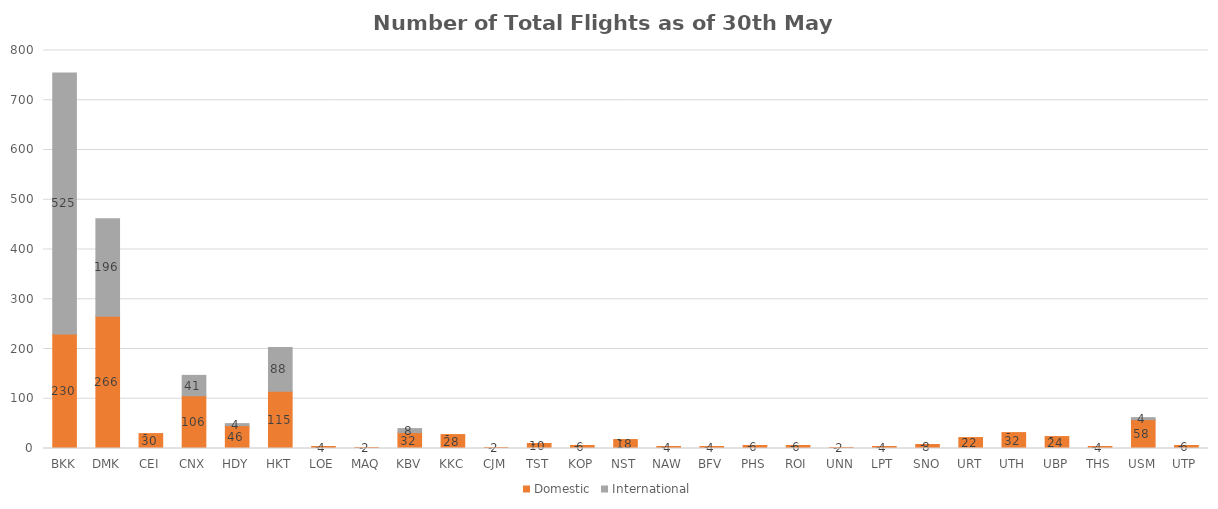
| Category | Domestic | International |
|---|---|---|
| BKK | 230 | 525 |
| DMK | 266 | 196 |
| CEI | 30 | 0 |
| CNX | 106 | 41 |
| HDY | 46 | 4 |
| HKT | 115 | 88 |
| LOE | 4 | 0 |
| MAQ | 2 | 0 |
| KBV | 32 | 8 |
| KKC | 28 | 0 |
| CJM | 2 | 0 |
| TST | 10 | 0 |
| KOP | 6 | 0 |
| NST | 18 | 0 |
| NAW | 4 | 0 |
| BFV | 4 | 0 |
| PHS | 6 | 0 |
| ROI | 6 | 0 |
| UNN | 2 | 0 |
| LPT | 4 | 0 |
| SNO | 8 | 0 |
| URT | 22 | 0 |
| UTH | 32 | 0 |
| UBP | 24 | 0 |
| THS | 4 | 0 |
| USM | 58 | 4 |
| UTP | 6 | 0 |